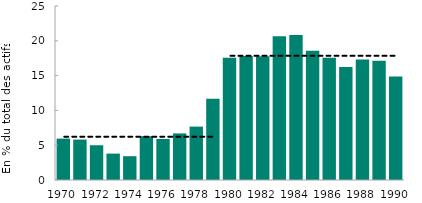
| Category | Series 0 |
|---|---|
| 1970.0 | 5.946 |
| 1971.0 | 5.808 |
| 1972.0 | 4.992 |
| 1973.0 | 3.794 |
| 1974.0 | 3.421 |
| 1975.0 | 6.285 |
| 1976.0 | 5.901 |
| 1977.0 | 6.693 |
| 1978.0 | 7.67 |
| 1979.0 | 11.674 |
| 1980.0 | 17.57 |
| 1981.0 | 17.801 |
| 1982.0 | 17.782 |
| 1983.0 | 20.64 |
| 1984.0 | 20.828 |
| 1985.0 | 18.56 |
| 1986.0 | 17.57 |
| 1987.0 | 16.232 |
| 1988.0 | 17.3 |
| 1989.0 | 17.146 |
| 1990.0 | 14.858 |